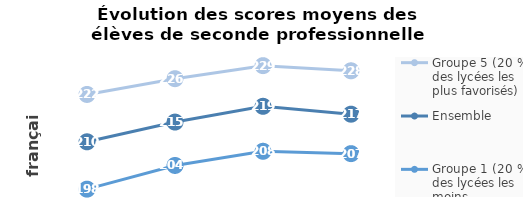
| Category | Groupe 5 (20 % des lycées les plus favorisés) | Ensemble | Groupe 1 (20 % des lycées les moins favorisés) |
|---|---|---|---|
| 2019.0 | 222 | 210 | 198 |
| 2020.0 | 226 | 215 | 204 |
| 2021.0 | 229.3 | 219 | 207.6 |
| 2022.0 | 228 | 217 | 207 |